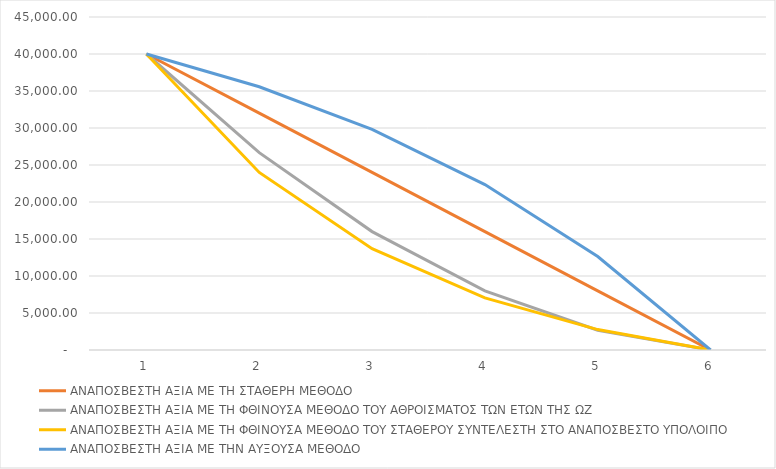
| Category |  ΑΝΑΠΟΣΒΕΣΤΗ ΑΞΙΑ ΜΕ ΤΗ ΣΤΑΘΕΡΗ ΜΕΘΟΔΟ  |  ΑΝΑΠΟΣΒΕΣΤΗ ΑΞΙΑ ΜΕ ΤΗ ΦΘΙΝΟΥΣΑ ΜΕΘΟΔΟ ΤΟΥ ΑΘΡΟΙΣΜΑΤΟΣ ΤΩΝ ΕΤΩΝ ΤΗΣ ΩΖ  |  ΑΝΑΠΟΣΒΕΣΤΗ ΑΞΙΑ ΜΕ ΤΗ ΦΘΙΝΟΥΣΑ ΜΕΘΟΔΟ ΤΟΥ ΣΤΑΘΕΡΟΥ ΣΥΝΤΕΛΕΣΤΗ ΣΤΟ ΑΝΑΠΟΣΒΕΣΤΟ ΥΠΟΛΟΙΠΟ  |  ΑΝΑΠΟΣΒΕΣΤΗ ΑΞΙΑ ΜΕ ΤΗΝ ΑΥΞΟΥΣΑ ΜΕΘΟΔΟ  |
|---|---|---|---|---|
| 0 | 40000 | 40000 | 40000 | 40000 |
| 1 | 32000 | 26666.667 | 23997.731 | 35576.738 |
| 2 | 24000 | 16000 | 13685.964 | 29826.498 |
| 3 | 16000 | 8000 | 7041.123 | 22351.185 |
| 4 | 8000 | 2666.667 | 2759.228 | 12633.278 |
| 5 | 0 | 0 | 0 | 0 |